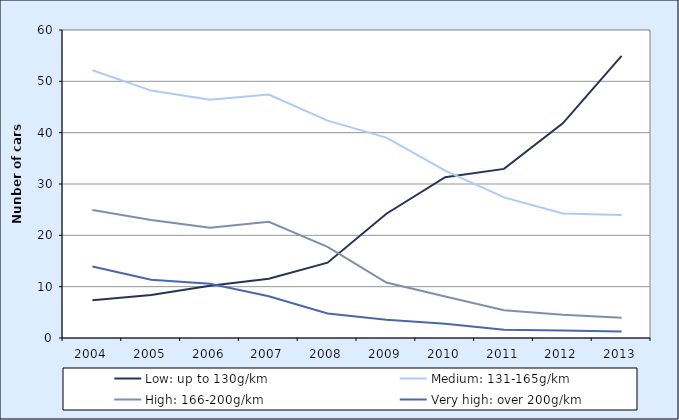
| Category | Low: up to 130g/km | Medium: 131-165g/km | High: 166-200g/km | Very high: over 200g/km |
|---|---|---|---|---|
| 2004.0 | 7.338 | 52.151 | 24.924 | 13.933 |
| 2005.0 | 8.355 | 48.2 | 22.973 | 11.345 |
| 2006.0 | 10.175 | 46.396 | 21.471 | 10.567 |
| 2007.0 | 11.558 | 47.432 | 22.623 | 8.128 |
| 2008.0 | 14.667 | 42.339 | 17.769 | 4.769 |
| 2009.0 | 24.204 | 39.041 | 10.812 | 3.545 |
| 2010.0 | 31.329 | 32.598 | 8.083 | 2.78 |
| 2011.0 | 32.942 | 27.391 | 5.401 | 1.627 |
| 2012.0 | 41.819 | 24.246 | 4.542 | 1.437 |
| 2013.0 | 54.977 | 23.943 | 3.946 | 1.258 |